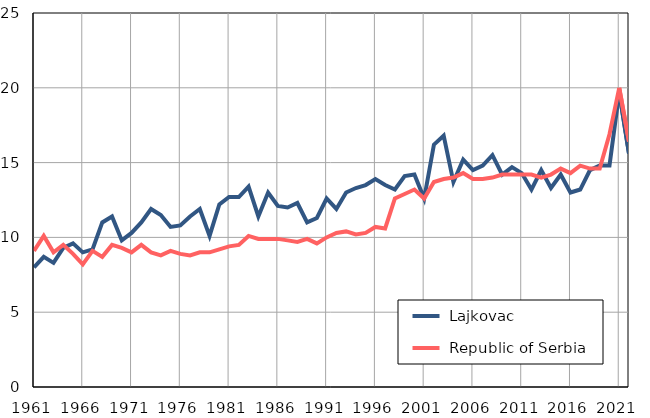
| Category |  Lajkovac |  Republic of Serbia |
|---|---|---|
| 1961.0 | 8 | 9.1 |
| 1962.0 | 8.7 | 10.1 |
| 1963.0 | 8.3 | 9 |
| 1964.0 | 9.3 | 9.5 |
| 1965.0 | 9.6 | 8.9 |
| 1966.0 | 9 | 8.2 |
| 1967.0 | 9.2 | 9.1 |
| 1968.0 | 11 | 8.7 |
| 1969.0 | 11.4 | 9.5 |
| 1970.0 | 9.8 | 9.3 |
| 1971.0 | 10.3 | 9 |
| 1972.0 | 11 | 9.5 |
| 1973.0 | 11.9 | 9 |
| 1974.0 | 11.5 | 8.8 |
| 1975.0 | 10.7 | 9.1 |
| 1976.0 | 10.8 | 8.9 |
| 1977.0 | 11.4 | 8.8 |
| 1978.0 | 11.9 | 9 |
| 1979.0 | 10.1 | 9 |
| 1980.0 | 12.2 | 9.2 |
| 1981.0 | 12.7 | 9.4 |
| 1982.0 | 12.7 | 9.5 |
| 1983.0 | 13.4 | 10.1 |
| 1984.0 | 11.4 | 9.9 |
| 1985.0 | 13 | 9.9 |
| 1986.0 | 12.1 | 9.9 |
| 1987.0 | 12 | 9.8 |
| 1988.0 | 12.3 | 9.7 |
| 1989.0 | 11 | 9.9 |
| 1990.0 | 11.3 | 9.6 |
| 1991.0 | 12.6 | 10 |
| 1992.0 | 11.9 | 10.3 |
| 1993.0 | 13 | 10.4 |
| 1994.0 | 13.3 | 10.2 |
| 1995.0 | 13.5 | 10.3 |
| 1996.0 | 13.9 | 10.7 |
| 1997.0 | 13.5 | 10.6 |
| 1998.0 | 13.2 | 12.6 |
| 1999.0 | 14.1 | 12.9 |
| 2000.0 | 14.2 | 13.2 |
| 2001.0 | 12.6 | 12.6 |
| 2002.0 | 16.2 | 13.7 |
| 2003.0 | 16.8 | 13.9 |
| 2004.0 | 13.7 | 14 |
| 2005.0 | 15.2 | 14.3 |
| 2006.0 | 14.5 | 13.9 |
| 2007.0 | 14.8 | 13.9 |
| 2008.0 | 15.5 | 14 |
| 2009.0 | 14.2 | 14.2 |
| 2010.0 | 14.7 | 14.2 |
| 2011.0 | 14.3 | 14.2 |
| 2012.0 | 13.2 | 14.2 |
| 2013.0 | 14.5 | 14 |
| 2014.0 | 13.3 | 14.2 |
| 2015.0 | 14.2 | 14.6 |
| 2016.0 | 13 | 14.3 |
| 2017.0 | 13.2 | 14.8 |
| 2018.0 | 14.5 | 14.6 |
| 2019.0 | 14.8 | 14.6 |
| 2020.0 | 14.8 | 16.9 |
| 2021.0 | 19.7 | 20 |
| 2022.0 | 15.6 | 16.4 |